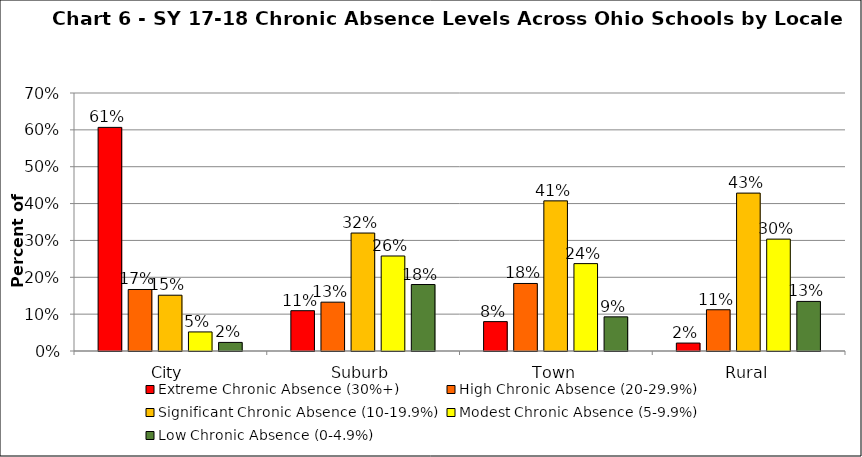
| Category | Extreme Chronic Absence (30%+) | High Chronic Absence (20-29.9%) | Significant Chronic Absence (10-19.9%) | Modest Chronic Absence (5-9.9%) | Low Chronic Absence (0-4.9%) |
|---|---|---|---|---|---|
| 0 | 0.607 | 0.167 | 0.151 | 0.052 | 0.023 |
| 1 | 0.109 | 0.132 | 0.32 | 0.258 | 0.18 |
| 2 | 0.08 | 0.183 | 0.407 | 0.237 | 0.093 |
| 3 | 0.022 | 0.112 | 0.428 | 0.304 | 0.135 |